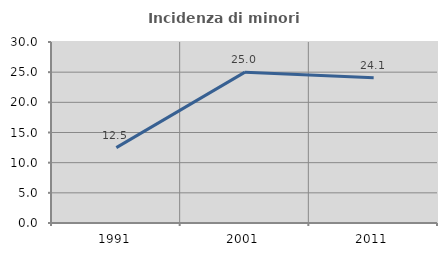
| Category | Incidenza di minori stranieri |
|---|---|
| 1991.0 | 12.5 |
| 2001.0 | 25 |
| 2011.0 | 24.09 |